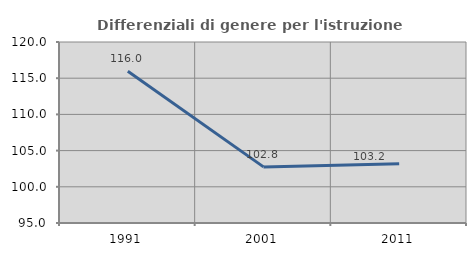
| Category | Differenziali di genere per l'istruzione superiore |
|---|---|
| 1991.0 | 115.966 |
| 2001.0 | 102.752 |
| 2011.0 | 103.174 |